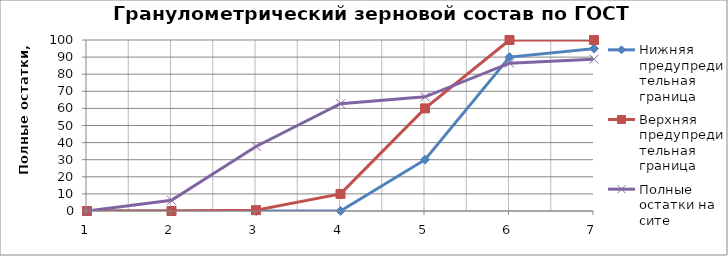
| Category | Нижняя предупредительная граница | Верхняя предупредительная граница | Полные остатки на сите |
|---|---|---|---|
| 0 | 0 | 0 | 0 |
| 1 | 0 | 0 | 6.24 |
| 2 | 0 | 0.5 | 37.76 |
| 3 | 0 | 10 | 62.76 |
| 4 | 30 | 60 | 66.76 |
| 5 | 90 | 100 | 86.47 |
| 6 | 95 | 100 | 88.77 |